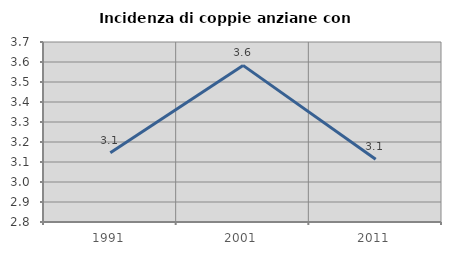
| Category | Incidenza di coppie anziane con figli |
|---|---|
| 1991.0 | 3.147 |
| 2001.0 | 3.583 |
| 2011.0 | 3.114 |